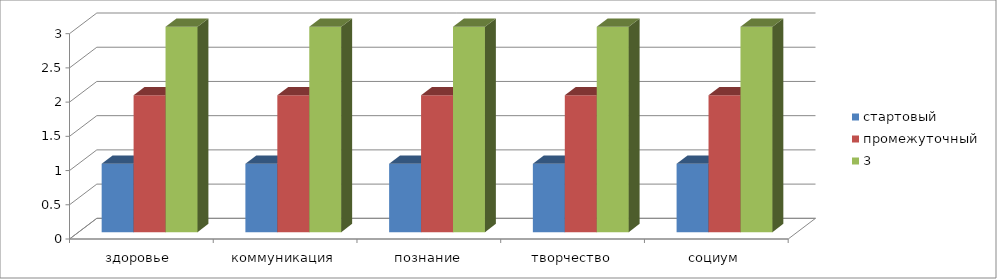
| Category | стартовый | промежуточный | 3 |
|---|---|---|---|
| здоровье  | 1 | 2 | 3 |
| коммуникация | 1 | 2 | 3 |
| познание | 1 | 2 | 3 |
| творчество | 1 | 2 | 3 |
| социум | 1 | 2 | 3 |